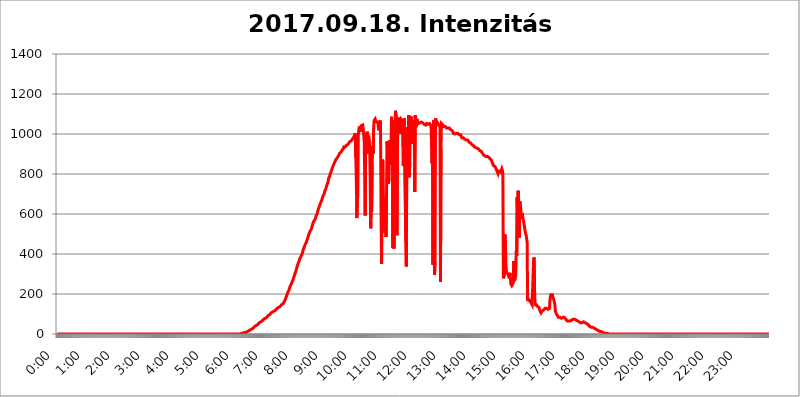
| Category | 2017.09.18. Intenzitás [W/m^2] |
|---|---|
| 0.0 | 0 |
| 0.0006944444444444445 | 0 |
| 0.001388888888888889 | 0 |
| 0.0020833333333333333 | 0 |
| 0.002777777777777778 | 0 |
| 0.003472222222222222 | 0 |
| 0.004166666666666667 | 0 |
| 0.004861111111111111 | 0 |
| 0.005555555555555556 | 0 |
| 0.0062499999999999995 | 0 |
| 0.006944444444444444 | 0 |
| 0.007638888888888889 | 0 |
| 0.008333333333333333 | 0 |
| 0.009027777777777779 | 0 |
| 0.009722222222222222 | 0 |
| 0.010416666666666666 | 0 |
| 0.011111111111111112 | 0 |
| 0.011805555555555555 | 0 |
| 0.012499999999999999 | 0 |
| 0.013194444444444444 | 0 |
| 0.013888888888888888 | 0 |
| 0.014583333333333332 | 0 |
| 0.015277777777777777 | 0 |
| 0.015972222222222224 | 0 |
| 0.016666666666666666 | 0 |
| 0.017361111111111112 | 0 |
| 0.018055555555555557 | 0 |
| 0.01875 | 0 |
| 0.019444444444444445 | 0 |
| 0.02013888888888889 | 0 |
| 0.020833333333333332 | 0 |
| 0.02152777777777778 | 0 |
| 0.022222222222222223 | 0 |
| 0.02291666666666667 | 0 |
| 0.02361111111111111 | 0 |
| 0.024305555555555556 | 0 |
| 0.024999999999999998 | 0 |
| 0.025694444444444447 | 0 |
| 0.02638888888888889 | 0 |
| 0.027083333333333334 | 0 |
| 0.027777777777777776 | 0 |
| 0.02847222222222222 | 0 |
| 0.029166666666666664 | 0 |
| 0.029861111111111113 | 0 |
| 0.030555555555555555 | 0 |
| 0.03125 | 0 |
| 0.03194444444444445 | 0 |
| 0.03263888888888889 | 0 |
| 0.03333333333333333 | 0 |
| 0.034027777777777775 | 0 |
| 0.034722222222222224 | 0 |
| 0.035416666666666666 | 0 |
| 0.036111111111111115 | 0 |
| 0.03680555555555556 | 0 |
| 0.0375 | 0 |
| 0.03819444444444444 | 0 |
| 0.03888888888888889 | 0 |
| 0.03958333333333333 | 0 |
| 0.04027777777777778 | 0 |
| 0.04097222222222222 | 0 |
| 0.041666666666666664 | 0 |
| 0.042361111111111106 | 0 |
| 0.04305555555555556 | 0 |
| 0.043750000000000004 | 0 |
| 0.044444444444444446 | 0 |
| 0.04513888888888889 | 0 |
| 0.04583333333333334 | 0 |
| 0.04652777777777778 | 0 |
| 0.04722222222222222 | 0 |
| 0.04791666666666666 | 0 |
| 0.04861111111111111 | 0 |
| 0.049305555555555554 | 0 |
| 0.049999999999999996 | 0 |
| 0.05069444444444445 | 0 |
| 0.051388888888888894 | 0 |
| 0.052083333333333336 | 0 |
| 0.05277777777777778 | 0 |
| 0.05347222222222222 | 0 |
| 0.05416666666666667 | 0 |
| 0.05486111111111111 | 0 |
| 0.05555555555555555 | 0 |
| 0.05625 | 0 |
| 0.05694444444444444 | 0 |
| 0.057638888888888885 | 0 |
| 0.05833333333333333 | 0 |
| 0.05902777777777778 | 0 |
| 0.059722222222222225 | 0 |
| 0.06041666666666667 | 0 |
| 0.061111111111111116 | 0 |
| 0.06180555555555556 | 0 |
| 0.0625 | 0 |
| 0.06319444444444444 | 0 |
| 0.06388888888888888 | 0 |
| 0.06458333333333334 | 0 |
| 0.06527777777777778 | 0 |
| 0.06597222222222222 | 0 |
| 0.06666666666666667 | 0 |
| 0.06736111111111111 | 0 |
| 0.06805555555555555 | 0 |
| 0.06874999999999999 | 0 |
| 0.06944444444444443 | 0 |
| 0.07013888888888889 | 0 |
| 0.07083333333333333 | 0 |
| 0.07152777777777779 | 0 |
| 0.07222222222222223 | 0 |
| 0.07291666666666667 | 0 |
| 0.07361111111111111 | 0 |
| 0.07430555555555556 | 0 |
| 0.075 | 0 |
| 0.07569444444444444 | 0 |
| 0.0763888888888889 | 0 |
| 0.07708333333333334 | 0 |
| 0.07777777777777778 | 0 |
| 0.07847222222222222 | 0 |
| 0.07916666666666666 | 0 |
| 0.0798611111111111 | 0 |
| 0.08055555555555556 | 0 |
| 0.08125 | 0 |
| 0.08194444444444444 | 0 |
| 0.08263888888888889 | 0 |
| 0.08333333333333333 | 0 |
| 0.08402777777777777 | 0 |
| 0.08472222222222221 | 0 |
| 0.08541666666666665 | 0 |
| 0.08611111111111112 | 0 |
| 0.08680555555555557 | 0 |
| 0.08750000000000001 | 0 |
| 0.08819444444444445 | 0 |
| 0.08888888888888889 | 0 |
| 0.08958333333333333 | 0 |
| 0.09027777777777778 | 0 |
| 0.09097222222222222 | 0 |
| 0.09166666666666667 | 0 |
| 0.09236111111111112 | 0 |
| 0.09305555555555556 | 0 |
| 0.09375 | 0 |
| 0.09444444444444444 | 0 |
| 0.09513888888888888 | 0 |
| 0.09583333333333333 | 0 |
| 0.09652777777777777 | 0 |
| 0.09722222222222222 | 0 |
| 0.09791666666666667 | 0 |
| 0.09861111111111111 | 0 |
| 0.09930555555555555 | 0 |
| 0.09999999999999999 | 0 |
| 0.10069444444444443 | 0 |
| 0.1013888888888889 | 0 |
| 0.10208333333333335 | 0 |
| 0.10277777777777779 | 0 |
| 0.10347222222222223 | 0 |
| 0.10416666666666667 | 0 |
| 0.10486111111111111 | 0 |
| 0.10555555555555556 | 0 |
| 0.10625 | 0 |
| 0.10694444444444444 | 0 |
| 0.1076388888888889 | 0 |
| 0.10833333333333334 | 0 |
| 0.10902777777777778 | 0 |
| 0.10972222222222222 | 0 |
| 0.1111111111111111 | 0 |
| 0.11180555555555556 | 0 |
| 0.11180555555555556 | 0 |
| 0.1125 | 0 |
| 0.11319444444444444 | 0 |
| 0.11388888888888889 | 0 |
| 0.11458333333333333 | 0 |
| 0.11527777777777777 | 0 |
| 0.11597222222222221 | 0 |
| 0.11666666666666665 | 0 |
| 0.1173611111111111 | 0 |
| 0.11805555555555557 | 0 |
| 0.11944444444444445 | 0 |
| 0.12013888888888889 | 0 |
| 0.12083333333333333 | 0 |
| 0.12152777777777778 | 0 |
| 0.12222222222222223 | 0 |
| 0.12291666666666667 | 0 |
| 0.12291666666666667 | 0 |
| 0.12361111111111112 | 0 |
| 0.12430555555555556 | 0 |
| 0.125 | 0 |
| 0.12569444444444444 | 0 |
| 0.12638888888888888 | 0 |
| 0.12708333333333333 | 0 |
| 0.16875 | 0 |
| 0.12847222222222224 | 0 |
| 0.12916666666666668 | 0 |
| 0.12986111111111112 | 0 |
| 0.13055555555555556 | 0 |
| 0.13125 | 0 |
| 0.13194444444444445 | 0 |
| 0.1326388888888889 | 0 |
| 0.13333333333333333 | 0 |
| 0.13402777777777777 | 0 |
| 0.13402777777777777 | 0 |
| 0.13472222222222222 | 0 |
| 0.13541666666666666 | 0 |
| 0.1361111111111111 | 0 |
| 0.13749999999999998 | 0 |
| 0.13819444444444443 | 0 |
| 0.1388888888888889 | 0 |
| 0.13958333333333334 | 0 |
| 0.14027777777777778 | 0 |
| 0.14097222222222222 | 0 |
| 0.14166666666666666 | 0 |
| 0.1423611111111111 | 0 |
| 0.14305555555555557 | 0 |
| 0.14375000000000002 | 0 |
| 0.14444444444444446 | 0 |
| 0.1451388888888889 | 0 |
| 0.1451388888888889 | 0 |
| 0.14652777777777778 | 0 |
| 0.14722222222222223 | 0 |
| 0.14791666666666667 | 0 |
| 0.1486111111111111 | 0 |
| 0.14930555555555555 | 0 |
| 0.15 | 0 |
| 0.15069444444444444 | 0 |
| 0.15138888888888888 | 0 |
| 0.15208333333333332 | 0 |
| 0.15277777777777776 | 0 |
| 0.15347222222222223 | 0 |
| 0.15416666666666667 | 0 |
| 0.15486111111111112 | 0 |
| 0.15555555555555556 | 0 |
| 0.15625 | 0 |
| 0.15694444444444444 | 0 |
| 0.15763888888888888 | 0 |
| 0.15833333333333333 | 0 |
| 0.15902777777777777 | 0 |
| 0.15972222222222224 | 0 |
| 0.16041666666666668 | 0 |
| 0.16111111111111112 | 0 |
| 0.16180555555555556 | 0 |
| 0.1625 | 0 |
| 0.16319444444444445 | 0 |
| 0.1638888888888889 | 0 |
| 0.16458333333333333 | 0 |
| 0.16527777777777777 | 0 |
| 0.16597222222222222 | 0 |
| 0.16666666666666666 | 0 |
| 0.1673611111111111 | 0 |
| 0.16805555555555554 | 0 |
| 0.16874999999999998 | 0 |
| 0.16944444444444443 | 0 |
| 0.17013888888888887 | 0 |
| 0.1708333333333333 | 0 |
| 0.17152777777777775 | 0 |
| 0.17222222222222225 | 0 |
| 0.1729166666666667 | 0 |
| 0.17361111111111113 | 0 |
| 0.17430555555555557 | 0 |
| 0.17500000000000002 | 0 |
| 0.17569444444444446 | 0 |
| 0.1763888888888889 | 0 |
| 0.17708333333333334 | 0 |
| 0.17777777777777778 | 0 |
| 0.17847222222222223 | 0 |
| 0.17916666666666667 | 0 |
| 0.1798611111111111 | 0 |
| 0.18055555555555555 | 0 |
| 0.18125 | 0 |
| 0.18194444444444444 | 0 |
| 0.1826388888888889 | 0 |
| 0.18333333333333335 | 0 |
| 0.1840277777777778 | 0 |
| 0.18472222222222223 | 0 |
| 0.18541666666666667 | 0 |
| 0.18611111111111112 | 0 |
| 0.18680555555555556 | 0 |
| 0.1875 | 0 |
| 0.18819444444444444 | 0 |
| 0.18888888888888888 | 0 |
| 0.18958333333333333 | 0 |
| 0.19027777777777777 | 0 |
| 0.1909722222222222 | 0 |
| 0.19166666666666665 | 0 |
| 0.19236111111111112 | 0 |
| 0.19305555555555554 | 0 |
| 0.19375 | 0 |
| 0.19444444444444445 | 0 |
| 0.1951388888888889 | 0 |
| 0.19583333333333333 | 0 |
| 0.19652777777777777 | 0 |
| 0.19722222222222222 | 0 |
| 0.19791666666666666 | 0 |
| 0.1986111111111111 | 0 |
| 0.19930555555555554 | 0 |
| 0.19999999999999998 | 0 |
| 0.20069444444444443 | 0 |
| 0.20138888888888887 | 0 |
| 0.2020833333333333 | 0 |
| 0.2027777777777778 | 0 |
| 0.2034722222222222 | 0 |
| 0.2041666666666667 | 0 |
| 0.20486111111111113 | 0 |
| 0.20555555555555557 | 0 |
| 0.20625000000000002 | 0 |
| 0.20694444444444446 | 0 |
| 0.2076388888888889 | 0 |
| 0.20833333333333334 | 0 |
| 0.20902777777777778 | 0 |
| 0.20972222222222223 | 0 |
| 0.21041666666666667 | 0 |
| 0.2111111111111111 | 0 |
| 0.21180555555555555 | 0 |
| 0.2125 | 0 |
| 0.21319444444444444 | 0 |
| 0.2138888888888889 | 0 |
| 0.21458333333333335 | 0 |
| 0.2152777777777778 | 0 |
| 0.21597222222222223 | 0 |
| 0.21666666666666667 | 0 |
| 0.21736111111111112 | 0 |
| 0.21805555555555556 | 0 |
| 0.21875 | 0 |
| 0.21944444444444444 | 0 |
| 0.22013888888888888 | 0 |
| 0.22083333333333333 | 0 |
| 0.22152777777777777 | 0 |
| 0.2222222222222222 | 0 |
| 0.22291666666666665 | 0 |
| 0.2236111111111111 | 0 |
| 0.22430555555555556 | 0 |
| 0.225 | 0 |
| 0.22569444444444445 | 0 |
| 0.2263888888888889 | 0 |
| 0.22708333333333333 | 0 |
| 0.22777777777777777 | 0 |
| 0.22847222222222222 | 0 |
| 0.22916666666666666 | 0 |
| 0.2298611111111111 | 0 |
| 0.23055555555555554 | 0 |
| 0.23124999999999998 | 0 |
| 0.23194444444444443 | 0 |
| 0.23263888888888887 | 0 |
| 0.2333333333333333 | 0 |
| 0.2340277777777778 | 0 |
| 0.2347222222222222 | 0 |
| 0.2354166666666667 | 0 |
| 0.23611111111111113 | 0 |
| 0.23680555555555557 | 0 |
| 0.23750000000000002 | 0 |
| 0.23819444444444446 | 0 |
| 0.2388888888888889 | 0 |
| 0.23958333333333334 | 0 |
| 0.24027777777777778 | 0 |
| 0.24097222222222223 | 0 |
| 0.24166666666666667 | 0 |
| 0.2423611111111111 | 0 |
| 0.24305555555555555 | 0 |
| 0.24375 | 0 |
| 0.24444444444444446 | 0 |
| 0.24513888888888888 | 0 |
| 0.24583333333333335 | 0 |
| 0.2465277777777778 | 0 |
| 0.24722222222222223 | 0 |
| 0.24791666666666667 | 0 |
| 0.24861111111111112 | 0 |
| 0.24930555555555556 | 0 |
| 0.25 | 0 |
| 0.25069444444444444 | 0 |
| 0.2513888888888889 | 0 |
| 0.2520833333333333 | 0 |
| 0.25277777777777777 | 0 |
| 0.2534722222222222 | 0 |
| 0.25416666666666665 | 0 |
| 0.2548611111111111 | 0 |
| 0.2555555555555556 | 0 |
| 0.25625000000000003 | 0 |
| 0.2569444444444445 | 3.525 |
| 0.2576388888888889 | 3.525 |
| 0.25833333333333336 | 3.525 |
| 0.2590277777777778 | 3.525 |
| 0.25972222222222224 | 3.525 |
| 0.2604166666666667 | 3.525 |
| 0.2611111111111111 | 3.525 |
| 0.26180555555555557 | 3.525 |
| 0.2625 | 7.887 |
| 0.26319444444444445 | 7.887 |
| 0.2638888888888889 | 7.887 |
| 0.26458333333333334 | 7.887 |
| 0.2652777777777778 | 12.257 |
| 0.2659722222222222 | 12.257 |
| 0.26666666666666666 | 12.257 |
| 0.2673611111111111 | 12.257 |
| 0.26805555555555555 | 16.636 |
| 0.26875 | 16.636 |
| 0.26944444444444443 | 16.636 |
| 0.2701388888888889 | 21.024 |
| 0.2708333333333333 | 21.024 |
| 0.27152777777777776 | 25.419 |
| 0.2722222222222222 | 25.419 |
| 0.27291666666666664 | 25.419 |
| 0.2736111111111111 | 29.823 |
| 0.2743055555555555 | 29.823 |
| 0.27499999999999997 | 29.823 |
| 0.27569444444444446 | 34.234 |
| 0.27638888888888885 | 34.234 |
| 0.27708333333333335 | 38.653 |
| 0.2777777777777778 | 38.653 |
| 0.27847222222222223 | 38.653 |
| 0.2791666666666667 | 43.079 |
| 0.2798611111111111 | 43.079 |
| 0.28055555555555556 | 47.511 |
| 0.28125 | 47.511 |
| 0.28194444444444444 | 51.951 |
| 0.2826388888888889 | 51.951 |
| 0.2833333333333333 | 56.398 |
| 0.28402777777777777 | 56.398 |
| 0.2847222222222222 | 56.398 |
| 0.28541666666666665 | 60.85 |
| 0.28611111111111115 | 60.85 |
| 0.28680555555555554 | 65.31 |
| 0.28750000000000003 | 65.31 |
| 0.2881944444444445 | 69.775 |
| 0.2888888888888889 | 69.775 |
| 0.28958333333333336 | 74.246 |
| 0.2902777777777778 | 74.246 |
| 0.29097222222222224 | 78.722 |
| 0.2916666666666667 | 78.722 |
| 0.2923611111111111 | 78.722 |
| 0.29305555555555557 | 83.205 |
| 0.29375 | 83.205 |
| 0.29444444444444445 | 87.692 |
| 0.2951388888888889 | 87.692 |
| 0.29583333333333334 | 92.184 |
| 0.2965277777777778 | 92.184 |
| 0.2972222222222222 | 96.682 |
| 0.29791666666666666 | 96.682 |
| 0.2986111111111111 | 101.184 |
| 0.29930555555555555 | 101.184 |
| 0.3 | 105.69 |
| 0.30069444444444443 | 105.69 |
| 0.3013888888888889 | 105.69 |
| 0.3020833333333333 | 110.201 |
| 0.30277777777777776 | 110.201 |
| 0.3034722222222222 | 110.201 |
| 0.30416666666666664 | 114.716 |
| 0.3048611111111111 | 114.716 |
| 0.3055555555555555 | 119.235 |
| 0.30624999999999997 | 119.235 |
| 0.3069444444444444 | 119.235 |
| 0.3076388888888889 | 123.758 |
| 0.30833333333333335 | 128.284 |
| 0.3090277777777778 | 128.284 |
| 0.30972222222222223 | 128.284 |
| 0.3104166666666667 | 132.814 |
| 0.3111111111111111 | 132.814 |
| 0.31180555555555556 | 137.347 |
| 0.3125 | 137.347 |
| 0.31319444444444444 | 141.884 |
| 0.3138888888888889 | 141.884 |
| 0.3145833333333333 | 146.423 |
| 0.31527777777777777 | 146.423 |
| 0.3159722222222222 | 146.423 |
| 0.31666666666666665 | 150.964 |
| 0.31736111111111115 | 155.509 |
| 0.31805555555555554 | 160.056 |
| 0.31875000000000003 | 164.605 |
| 0.3194444444444445 | 169.156 |
| 0.3201388888888889 | 173.709 |
| 0.32083333333333336 | 182.82 |
| 0.3215277777777778 | 187.378 |
| 0.32222222222222224 | 196.497 |
| 0.3229166666666667 | 201.058 |
| 0.3236111111111111 | 210.182 |
| 0.32430555555555557 | 214.746 |
| 0.325 | 219.309 |
| 0.32569444444444445 | 228.436 |
| 0.3263888888888889 | 233 |
| 0.32708333333333334 | 242.127 |
| 0.3277777777777778 | 246.689 |
| 0.3284722222222222 | 251.251 |
| 0.32916666666666666 | 260.373 |
| 0.3298611111111111 | 264.932 |
| 0.33055555555555555 | 269.49 |
| 0.33125 | 278.603 |
| 0.33194444444444443 | 283.156 |
| 0.3326388888888889 | 292.259 |
| 0.3333333333333333 | 301.354 |
| 0.3340277777777778 | 305.898 |
| 0.3347222222222222 | 314.98 |
| 0.3354166666666667 | 324.052 |
| 0.3361111111111111 | 333.113 |
| 0.3368055555555556 | 342.162 |
| 0.33749999999999997 | 346.682 |
| 0.33819444444444446 | 355.712 |
| 0.33888888888888885 | 360.221 |
| 0.33958333333333335 | 369.23 |
| 0.34027777777777773 | 378.224 |
| 0.34097222222222223 | 378.224 |
| 0.3416666666666666 | 387.202 |
| 0.3423611111111111 | 391.685 |
| 0.3430555555555555 | 396.164 |
| 0.34375 | 405.108 |
| 0.3444444444444445 | 414.035 |
| 0.3451388888888889 | 422.943 |
| 0.3458333333333334 | 427.39 |
| 0.34652777777777777 | 436.27 |
| 0.34722222222222227 | 440.702 |
| 0.34791666666666665 | 449.551 |
| 0.34861111111111115 | 453.968 |
| 0.34930555555555554 | 458.38 |
| 0.35000000000000003 | 467.187 |
| 0.3506944444444444 | 471.582 |
| 0.3513888888888889 | 480.356 |
| 0.3520833333333333 | 489.108 |
| 0.3527777777777778 | 497.836 |
| 0.3534722222222222 | 502.192 |
| 0.3541666666666667 | 510.885 |
| 0.3548611111111111 | 515.223 |
| 0.35555555555555557 | 515.223 |
| 0.35625 | 523.88 |
| 0.35694444444444445 | 532.513 |
| 0.3576388888888889 | 541.121 |
| 0.35833333333333334 | 549.704 |
| 0.3590277777777778 | 558.261 |
| 0.3597222222222222 | 562.53 |
| 0.36041666666666666 | 566.793 |
| 0.3611111111111111 | 571.049 |
| 0.36180555555555555 | 575.299 |
| 0.3625 | 583.779 |
| 0.36319444444444443 | 592.233 |
| 0.3638888888888889 | 596.45 |
| 0.3645833333333333 | 600.661 |
| 0.3652777777777778 | 613.252 |
| 0.3659722222222222 | 621.613 |
| 0.3666666666666667 | 629.948 |
| 0.3673611111111111 | 634.105 |
| 0.3680555555555556 | 642.4 |
| 0.36874999999999997 | 650.667 |
| 0.36944444444444446 | 654.791 |
| 0.37013888888888885 | 663.019 |
| 0.37083333333333335 | 667.123 |
| 0.37152777777777773 | 675.311 |
| 0.37222222222222223 | 683.473 |
| 0.3729166666666666 | 691.608 |
| 0.3736111111111111 | 695.666 |
| 0.3743055555555555 | 699.717 |
| 0.375 | 711.832 |
| 0.3756944444444445 | 715.858 |
| 0.3763888888888889 | 723.889 |
| 0.3770833333333334 | 731.896 |
| 0.37777777777777777 | 739.877 |
| 0.37847222222222227 | 747.834 |
| 0.37916666666666665 | 751.803 |
| 0.37986111111111115 | 759.723 |
| 0.38055555555555554 | 779.42 |
| 0.38125000000000003 | 779.42 |
| 0.3819444444444444 | 787.258 |
| 0.3826388888888889 | 798.974 |
| 0.3833333333333333 | 802.868 |
| 0.3840277777777778 | 810.641 |
| 0.3847222222222222 | 818.392 |
| 0.3854166666666667 | 826.123 |
| 0.3861111111111111 | 833.834 |
| 0.38680555555555557 | 837.682 |
| 0.3875 | 845.365 |
| 0.38819444444444445 | 849.199 |
| 0.3888888888888889 | 856.855 |
| 0.38958333333333334 | 860.676 |
| 0.3902777777777778 | 868.305 |
| 0.3909722222222222 | 868.305 |
| 0.39166666666666666 | 875.918 |
| 0.3923611111111111 | 879.719 |
| 0.39305555555555555 | 883.516 |
| 0.39375 | 887.309 |
| 0.39444444444444443 | 891.099 |
| 0.3951388888888889 | 894.885 |
| 0.3958333333333333 | 902.447 |
| 0.3965277777777778 | 902.447 |
| 0.3972222222222222 | 906.223 |
| 0.3979166666666667 | 909.996 |
| 0.3986111111111111 | 913.766 |
| 0.3993055555555556 | 917.534 |
| 0.39999999999999997 | 921.298 |
| 0.40069444444444446 | 917.534 |
| 0.40138888888888885 | 928.819 |
| 0.40208333333333335 | 936.33 |
| 0.40277777777777773 | 936.33 |
| 0.40347222222222223 | 940.082 |
| 0.4041666666666666 | 936.33 |
| 0.4048611111111111 | 940.082 |
| 0.4055555555555555 | 943.832 |
| 0.40625 | 943.832 |
| 0.4069444444444445 | 947.58 |
| 0.4076388888888889 | 947.58 |
| 0.4083333333333334 | 951.327 |
| 0.40902777777777777 | 955.071 |
| 0.40972222222222227 | 955.071 |
| 0.41041666666666665 | 962.555 |
| 0.41111111111111115 | 962.555 |
| 0.41180555555555554 | 962.555 |
| 0.41250000000000003 | 966.295 |
| 0.4131944444444444 | 970.034 |
| 0.4138888888888889 | 973.772 |
| 0.4145833333333333 | 977.508 |
| 0.4152777777777778 | 977.508 |
| 0.4159722222222222 | 984.98 |
| 0.4166666666666667 | 988.714 |
| 0.4173611111111111 | 996.182 |
| 0.41805555555555557 | 1003.65 |
| 0.41875 | 883.516 |
| 0.41944444444444445 | 771.559 |
| 0.4201388888888889 | 579.542 |
| 0.42083333333333334 | 658.909 |
| 0.4215277777777778 | 691.608 |
| 0.4222222222222222 | 992.448 |
| 0.42291666666666666 | 1018.587 |
| 0.4236111111111111 | 1037.277 |
| 0.42430555555555555 | 1041.019 |
| 0.425 | 1037.277 |
| 0.42569444444444443 | 1011.118 |
| 0.4263888888888889 | 1041.019 |
| 0.4270833333333333 | 1037.277 |
| 0.4277777777777778 | 1044.762 |
| 0.4284722222222222 | 1044.762 |
| 0.4291666666666667 | 1022.323 |
| 0.4298611111111111 | 996.182 |
| 0.4305555555555556 | 962.555 |
| 0.43124999999999997 | 962.555 |
| 0.43194444444444446 | 592.233 |
| 0.43263888888888885 | 999.916 |
| 0.43333333333333335 | 984.98 |
| 0.43402777777777773 | 966.295 |
| 0.43472222222222223 | 1011.118 |
| 0.4354166666666666 | 902.447 |
| 0.4361111111111111 | 977.508 |
| 0.4368055555555555 | 992.448 |
| 0.4375 | 996.182 |
| 0.4381944444444445 | 928.819 |
| 0.4388888888888889 | 779.42 |
| 0.4395833333333334 | 528.2 |
| 0.44027777777777777 | 650.667 |
| 0.44097222222222227 | 613.252 |
| 0.44166666666666665 | 849.199 |
| 0.44236111111111115 | 940.082 |
| 0.44305555555555554 | 902.447 |
| 0.44375000000000003 | 1029.798 |
| 0.4444444444444444 | 1067.267 |
| 0.4451388888888889 | 1067.267 |
| 0.4458333333333333 | 1074.789 |
| 0.4465277777777778 | 1067.267 |
| 0.4472222222222222 | 1063.51 |
| 0.4479166666666667 | 1063.51 |
| 0.4486111111111111 | 1059.756 |
| 0.44930555555555557 | 1059.756 |
| 0.45 | 1052.255 |
| 0.45069444444444445 | 1018.587 |
| 0.4513888888888889 | 1059.756 |
| 0.45208333333333334 | 1048.508 |
| 0.4527777777777778 | 1067.267 |
| 0.4534722222222222 | 1007.383 |
| 0.45416666666666666 | 609.062 |
| 0.4548611111111111 | 351.198 |
| 0.45555555555555555 | 841.526 |
| 0.45625 | 872.114 |
| 0.45694444444444443 | 860.676 |
| 0.4576388888888889 | 558.261 |
| 0.4583333333333333 | 506.542 |
| 0.4590277777777778 | 683.473 |
| 0.4597222222222222 | 687.544 |
| 0.4604166666666667 | 596.45 |
| 0.4611111111111111 | 484.735 |
| 0.4618055555555556 | 687.544 |
| 0.46249999999999997 | 962.555 |
| 0.46319444444444446 | 921.298 |
| 0.46388888888888885 | 787.258 |
| 0.46458333333333335 | 751.803 |
| 0.46527777777777773 | 779.42 |
| 0.46597222222222223 | 970.034 |
| 0.4666666666666666 | 966.295 |
| 0.4673611111111111 | 845.365 |
| 0.4680555555555555 | 917.534 |
| 0.46875 | 1086.097 |
| 0.4694444444444445 | 913.766 |
| 0.4701388888888889 | 1067.267 |
| 0.4708333333333334 | 431.833 |
| 0.47152777777777777 | 743.859 |
| 0.47222222222222227 | 427.39 |
| 0.47291666666666665 | 1003.65 |
| 0.47361111111111115 | 1041.019 |
| 0.47430555555555554 | 1116.426 |
| 0.47500000000000003 | 1101.226 |
| 0.4756944444444444 | 1089.873 |
| 0.4763888888888889 | 493.475 |
| 0.4770833333333333 | 891.099 |
| 0.4777777777777778 | 1071.027 |
| 0.4784722222222222 | 1082.324 |
| 0.4791666666666667 | 1086.097 |
| 0.4798611111111111 | 1086.097 |
| 0.48055555555555557 | 999.916 |
| 0.48125 | 1067.267 |
| 0.48194444444444445 | 1074.789 |
| 0.4826388888888889 | 1078.555 |
| 0.48333333333333334 | 1074.789 |
| 0.4840277777777778 | 1063.51 |
| 0.4847222222222222 | 940.082 |
| 0.48541666666666666 | 841.526 |
| 0.4861111111111111 | 1018.587 |
| 0.48680555555555555 | 1078.555 |
| 0.4875 | 1078.555 |
| 0.48819444444444443 | 1078.555 |
| 0.4888888888888889 | 458.38 |
| 0.4895833333333333 | 337.639 |
| 0.4902777777777778 | 943.832 |
| 0.4909722222222222 | 1033.537 |
| 0.4916666666666667 | 1037.277 |
| 0.4923611111111111 | 1014.852 |
| 0.4930555555555556 | 1093.653 |
| 0.49374999999999997 | 783.342 |
| 0.49444444444444446 | 856.855 |
| 0.49513888888888885 | 1089.873 |
| 0.49583333333333335 | 1056.004 |
| 0.49652777777777773 | 1086.097 |
| 0.49722222222222223 | 1086.097 |
| 0.4979166666666666 | 1086.097 |
| 0.4986111111111111 | 951.327 |
| 0.4993055555555555 | 1018.587 |
| 0.5 | 1059.756 |
| 0.5006944444444444 | 1067.267 |
| 0.5013888888888889 | 711.832 |
| 0.5020833333333333 | 1093.653 |
| 0.5027777777777778 | 1052.255 |
| 0.5034722222222222 | 1033.537 |
| 0.5041666666666667 | 1074.789 |
| 0.5048611111111111 | 1074.789 |
| 0.5055555555555555 | 1074.789 |
| 0.50625 | 1052.255 |
| 0.5069444444444444 | 1048.508 |
| 0.5076388888888889 | 1052.255 |
| 0.5083333333333333 | 1056.004 |
| 0.5090277777777777 | 1059.756 |
| 0.5097222222222222 | 1059.756 |
| 0.5104166666666666 | 1059.756 |
| 0.5111111111111112 | 1059.756 |
| 0.5118055555555555 | 1056.004 |
| 0.5125000000000001 | 1056.004 |
| 0.5131944444444444 | 1052.255 |
| 0.513888888888889 | 1052.255 |
| 0.5145833333333333 | 1048.508 |
| 0.5152777777777778 | 1044.762 |
| 0.5159722222222222 | 1044.762 |
| 0.5166666666666667 | 1044.762 |
| 0.517361111111111 | 1048.508 |
| 0.5180555555555556 | 1052.255 |
| 0.5187499999999999 | 1052.255 |
| 0.5194444444444445 | 1052.255 |
| 0.5201388888888888 | 1048.508 |
| 0.5208333333333334 | 1052.255 |
| 0.5215277777777778 | 1052.255 |
| 0.5222222222222223 | 1052.255 |
| 0.5229166666666667 | 1056.004 |
| 0.5236111111111111 | 1052.255 |
| 0.5243055555555556 | 1041.019 |
| 0.525 | 1044.762 |
| 0.5256944444444445 | 853.029 |
| 0.5263888888888889 | 1033.537 |
| 0.5270833333333333 | 346.682 |
| 0.5277777777777778 | 1067.267 |
| 0.5284722222222222 | 1071.027 |
| 0.5291666666666667 | 296.808 |
| 0.5298611111111111 | 360.221 |
| 0.5305555555555556 | 1078.555 |
| 0.53125 | 1067.267 |
| 0.5319444444444444 | 1063.51 |
| 0.5326388888888889 | 1063.51 |
| 0.5333333333333333 | 1056.004 |
| 0.5340277777777778 | 1052.255 |
| 0.5347222222222222 | 1044.762 |
| 0.5354166666666667 | 1044.762 |
| 0.5361111111111111 | 1048.508 |
| 0.5368055555555555 | 1044.762 |
| 0.5375 | 260.373 |
| 0.5381944444444444 | 925.06 |
| 0.5388888888888889 | 1052.255 |
| 0.5395833333333333 | 1056.004 |
| 0.5402777777777777 | 1052.255 |
| 0.5409722222222222 | 1044.762 |
| 0.5416666666666666 | 1041.019 |
| 0.5423611111111112 | 1037.277 |
| 0.5430555555555555 | 1037.277 |
| 0.5437500000000001 | 1037.277 |
| 0.5444444444444444 | 1037.277 |
| 0.545138888888889 | 1033.537 |
| 0.5458333333333333 | 1029.798 |
| 0.5465277777777778 | 1029.798 |
| 0.5472222222222222 | 1029.798 |
| 0.5479166666666667 | 1029.798 |
| 0.548611111111111 | 1029.798 |
| 0.5493055555555556 | 1029.798 |
| 0.5499999999999999 | 1029.798 |
| 0.5506944444444445 | 1026.06 |
| 0.5513888888888888 | 1022.323 |
| 0.5520833333333334 | 1022.323 |
| 0.5527777777777778 | 1022.323 |
| 0.5534722222222223 | 1018.587 |
| 0.5541666666666667 | 1014.852 |
| 0.5548611111111111 | 1011.118 |
| 0.5555555555555556 | 1003.65 |
| 0.55625 | 999.916 |
| 0.5569444444444445 | 999.916 |
| 0.5576388888888889 | 999.916 |
| 0.5583333333333333 | 1003.65 |
| 0.5590277777777778 | 1003.65 |
| 0.5597222222222222 | 1003.65 |
| 0.5604166666666667 | 1003.65 |
| 0.5611111111111111 | 1003.65 |
| 0.5618055555555556 | 1003.65 |
| 0.5625 | 1003.65 |
| 0.5631944444444444 | 999.916 |
| 0.5638888888888889 | 996.182 |
| 0.5645833333333333 | 999.916 |
| 0.5652777777777778 | 996.182 |
| 0.5659722222222222 | 996.182 |
| 0.5666666666666667 | 988.714 |
| 0.5673611111111111 | 981.244 |
| 0.5680555555555555 | 981.244 |
| 0.56875 | 981.244 |
| 0.5694444444444444 | 981.244 |
| 0.5701388888888889 | 977.508 |
| 0.5708333333333333 | 977.508 |
| 0.5715277777777777 | 973.772 |
| 0.5722222222222222 | 973.772 |
| 0.5729166666666666 | 970.034 |
| 0.5736111111111112 | 970.034 |
| 0.5743055555555555 | 970.034 |
| 0.5750000000000001 | 970.034 |
| 0.5756944444444444 | 970.034 |
| 0.576388888888889 | 966.295 |
| 0.5770833333333333 | 966.295 |
| 0.5777777777777778 | 958.814 |
| 0.5784722222222222 | 958.814 |
| 0.5791666666666667 | 958.814 |
| 0.579861111111111 | 955.071 |
| 0.5805555555555556 | 951.327 |
| 0.5812499999999999 | 947.58 |
| 0.5819444444444445 | 943.832 |
| 0.5826388888888888 | 947.58 |
| 0.5833333333333334 | 943.832 |
| 0.5840277777777778 | 940.082 |
| 0.5847222222222223 | 936.33 |
| 0.5854166666666667 | 932.576 |
| 0.5861111111111111 | 932.576 |
| 0.5868055555555556 | 932.576 |
| 0.5875 | 928.819 |
| 0.5881944444444445 | 928.819 |
| 0.5888888888888889 | 928.819 |
| 0.5895833333333333 | 928.819 |
| 0.5902777777777778 | 925.06 |
| 0.5909722222222222 | 925.06 |
| 0.5916666666666667 | 921.298 |
| 0.5923611111111111 | 917.534 |
| 0.5930555555555556 | 917.534 |
| 0.59375 | 913.766 |
| 0.5944444444444444 | 913.766 |
| 0.5951388888888889 | 909.996 |
| 0.5958333333333333 | 906.223 |
| 0.5965277777777778 | 902.447 |
| 0.5972222222222222 | 898.668 |
| 0.5979166666666667 | 894.885 |
| 0.5986111111111111 | 894.885 |
| 0.5993055555555555 | 891.099 |
| 0.6 | 891.099 |
| 0.6006944444444444 | 887.309 |
| 0.6013888888888889 | 887.309 |
| 0.6020833333333333 | 887.309 |
| 0.6027777777777777 | 887.309 |
| 0.6034722222222222 | 887.309 |
| 0.6041666666666666 | 887.309 |
| 0.6048611111111112 | 883.516 |
| 0.6055555555555555 | 883.516 |
| 0.6062500000000001 | 879.719 |
| 0.6069444444444444 | 875.918 |
| 0.607638888888889 | 875.918 |
| 0.6083333333333333 | 872.114 |
| 0.6090277777777778 | 868.305 |
| 0.6097222222222222 | 860.676 |
| 0.6104166666666667 | 860.676 |
| 0.611111111111111 | 849.199 |
| 0.6118055555555556 | 841.526 |
| 0.6124999999999999 | 841.526 |
| 0.6131944444444445 | 841.526 |
| 0.6138888888888888 | 837.682 |
| 0.6145833333333334 | 837.682 |
| 0.6152777777777778 | 833.834 |
| 0.6159722222222223 | 822.26 |
| 0.6166666666666667 | 822.26 |
| 0.6173611111111111 | 818.392 |
| 0.6180555555555556 | 802.868 |
| 0.61875 | 814.519 |
| 0.6194444444444445 | 814.519 |
| 0.6201388888888889 | 810.641 |
| 0.6208333333333333 | 814.519 |
| 0.6215277777777778 | 802.868 |
| 0.6222222222222222 | 810.641 |
| 0.6229166666666667 | 818.392 |
| 0.6236111111111111 | 826.123 |
| 0.6243055555555556 | 818.392 |
| 0.625 | 798.974 |
| 0.6256944444444444 | 278.603 |
| 0.6263888888888889 | 278.603 |
| 0.6270833333333333 | 296.808 |
| 0.6277777777777778 | 497.836 |
| 0.6284722222222222 | 475.972 |
| 0.6291666666666667 | 355.712 |
| 0.6298611111111111 | 314.98 |
| 0.6305555555555555 | 305.898 |
| 0.63125 | 310.44 |
| 0.6319444444444444 | 305.898 |
| 0.6326388888888889 | 296.808 |
| 0.6333333333333333 | 287.709 |
| 0.6340277777777777 | 278.603 |
| 0.6347222222222222 | 305.898 |
| 0.6354166666666666 | 287.709 |
| 0.6361111111111112 | 251.251 |
| 0.6368055555555555 | 246.689 |
| 0.6375000000000001 | 242.127 |
| 0.6381944444444444 | 242.127 |
| 0.638888888888889 | 242.127 |
| 0.6395833333333333 | 255.813 |
| 0.6402777777777778 | 364.728 |
| 0.6409722222222222 | 264.932 |
| 0.6416666666666667 | 269.49 |
| 0.642361111111111 | 278.603 |
| 0.6430555555555556 | 296.808 |
| 0.6437499999999999 | 414.035 |
| 0.6444444444444445 | 391.685 |
| 0.6451388888888888 | 683.473 |
| 0.6458333333333334 | 536.82 |
| 0.6465277777777778 | 715.858 |
| 0.6472222222222223 | 566.793 |
| 0.6479166666666667 | 480.356 |
| 0.6486111111111111 | 663.019 |
| 0.6493055555555556 | 654.791 |
| 0.65 | 629.948 |
| 0.6506944444444445 | 625.784 |
| 0.6513888888888889 | 575.299 |
| 0.6520833333333333 | 604.864 |
| 0.6527777777777778 | 588.009 |
| 0.6534722222222222 | 571.049 |
| 0.6541666666666667 | 562.53 |
| 0.6548611111111111 | 545.416 |
| 0.6555555555555556 | 528.2 |
| 0.65625 | 515.223 |
| 0.6569444444444444 | 502.192 |
| 0.6576388888888889 | 493.475 |
| 0.6583333333333333 | 489.108 |
| 0.6590277777777778 | 458.38 |
| 0.6597222222222222 | 164.605 |
| 0.6604166666666667 | 169.156 |
| 0.6611111111111111 | 173.709 |
| 0.6618055555555555 | 178.264 |
| 0.6625 | 173.709 |
| 0.6631944444444444 | 164.605 |
| 0.6638888888888889 | 160.056 |
| 0.6645833333333333 | 155.509 |
| 0.6652777777777777 | 150.964 |
| 0.6659722222222222 | 146.423 |
| 0.6666666666666666 | 150.964 |
| 0.6673611111111111 | 292.259 |
| 0.6680555555555556 | 360.221 |
| 0.6687500000000001 | 382.715 |
| 0.6694444444444444 | 223.873 |
| 0.6701388888888888 | 146.423 |
| 0.6708333333333334 | 141.884 |
| 0.6715277777777778 | 146.423 |
| 0.6722222222222222 | 146.423 |
| 0.6729166666666666 | 141.884 |
| 0.6736111111111112 | 137.347 |
| 0.6743055555555556 | 137.347 |
| 0.6749999999999999 | 137.347 |
| 0.6756944444444444 | 132.814 |
| 0.6763888888888889 | 123.758 |
| 0.6770833333333334 | 114.716 |
| 0.6777777777777777 | 110.201 |
| 0.6784722222222223 | 105.69 |
| 0.6791666666666667 | 110.201 |
| 0.6798611111111111 | 114.716 |
| 0.6805555555555555 | 119.235 |
| 0.68125 | 119.235 |
| 0.6819444444444445 | 119.235 |
| 0.6826388888888889 | 123.758 |
| 0.6833333333333332 | 123.758 |
| 0.6840277777777778 | 128.284 |
| 0.6847222222222222 | 128.284 |
| 0.6854166666666667 | 128.284 |
| 0.686111111111111 | 128.284 |
| 0.6868055555555556 | 128.284 |
| 0.6875 | 123.758 |
| 0.6881944444444444 | 123.758 |
| 0.688888888888889 | 123.758 |
| 0.6895833333333333 | 123.758 |
| 0.6902777777777778 | 128.284 |
| 0.6909722222222222 | 164.605 |
| 0.6916666666666668 | 187.378 |
| 0.6923611111111111 | 196.497 |
| 0.6930555555555555 | 191.937 |
| 0.69375 | 201.058 |
| 0.6944444444444445 | 196.497 |
| 0.6951388888888889 | 187.378 |
| 0.6958333333333333 | 178.264 |
| 0.6965277777777777 | 173.709 |
| 0.6972222222222223 | 160.056 |
| 0.6979166666666666 | 146.423 |
| 0.6986111111111111 | 114.716 |
| 0.6993055555555556 | 110.201 |
| 0.7000000000000001 | 101.184 |
| 0.7006944444444444 | 96.682 |
| 0.7013888888888888 | 92.184 |
| 0.7020833333333334 | 87.692 |
| 0.7027777777777778 | 83.205 |
| 0.7034722222222222 | 83.205 |
| 0.7041666666666666 | 83.205 |
| 0.7048611111111112 | 83.205 |
| 0.7055555555555556 | 78.722 |
| 0.7062499999999999 | 78.722 |
| 0.7069444444444444 | 78.722 |
| 0.7076388888888889 | 83.205 |
| 0.7083333333333334 | 83.205 |
| 0.7090277777777777 | 83.205 |
| 0.7097222222222223 | 83.205 |
| 0.7104166666666667 | 83.205 |
| 0.7111111111111111 | 83.205 |
| 0.7118055555555555 | 83.205 |
| 0.7125 | 83.205 |
| 0.7131944444444445 | 74.246 |
| 0.7138888888888889 | 74.246 |
| 0.7145833333333332 | 69.775 |
| 0.7152777777777778 | 65.31 |
| 0.7159722222222222 | 65.31 |
| 0.7166666666666667 | 65.31 |
| 0.717361111111111 | 65.31 |
| 0.7180555555555556 | 65.31 |
| 0.71875 | 65.31 |
| 0.7194444444444444 | 65.31 |
| 0.720138888888889 | 65.31 |
| 0.7208333333333333 | 65.31 |
| 0.7215277777777778 | 69.775 |
| 0.7222222222222222 | 69.775 |
| 0.7229166666666668 | 74.246 |
| 0.7236111111111111 | 74.246 |
| 0.7243055555555555 | 74.246 |
| 0.725 | 74.246 |
| 0.7256944444444445 | 74.246 |
| 0.7263888888888889 | 74.246 |
| 0.7270833333333333 | 74.246 |
| 0.7277777777777777 | 69.775 |
| 0.7284722222222223 | 65.31 |
| 0.7291666666666666 | 65.31 |
| 0.7298611111111111 | 65.31 |
| 0.7305555555555556 | 60.85 |
| 0.7312500000000001 | 60.85 |
| 0.7319444444444444 | 60.85 |
| 0.7326388888888888 | 60.85 |
| 0.7333333333333334 | 56.398 |
| 0.7340277777777778 | 56.398 |
| 0.7347222222222222 | 56.398 |
| 0.7354166666666666 | 56.398 |
| 0.7361111111111112 | 56.398 |
| 0.7368055555555556 | 56.398 |
| 0.7374999999999999 | 60.85 |
| 0.7381944444444444 | 60.85 |
| 0.7388888888888889 | 60.85 |
| 0.7395833333333334 | 60.85 |
| 0.7402777777777777 | 56.398 |
| 0.7409722222222223 | 56.398 |
| 0.7416666666666667 | 51.951 |
| 0.7423611111111111 | 51.951 |
| 0.7430555555555555 | 47.511 |
| 0.74375 | 47.511 |
| 0.7444444444444445 | 47.511 |
| 0.7451388888888889 | 43.079 |
| 0.7458333333333332 | 43.079 |
| 0.7465277777777778 | 38.653 |
| 0.7472222222222222 | 38.653 |
| 0.7479166666666667 | 38.653 |
| 0.748611111111111 | 34.234 |
| 0.7493055555555556 | 34.234 |
| 0.75 | 34.234 |
| 0.7506944444444444 | 34.234 |
| 0.751388888888889 | 29.823 |
| 0.7520833333333333 | 29.823 |
| 0.7527777777777778 | 29.823 |
| 0.7534722222222222 | 29.823 |
| 0.7541666666666668 | 29.823 |
| 0.7548611111111111 | 25.419 |
| 0.7555555555555555 | 25.419 |
| 0.75625 | 21.024 |
| 0.7569444444444445 | 21.024 |
| 0.7576388888888889 | 21.024 |
| 0.7583333333333333 | 16.636 |
| 0.7590277777777777 | 16.636 |
| 0.7597222222222223 | 16.636 |
| 0.7604166666666666 | 12.257 |
| 0.7611111111111111 | 12.257 |
| 0.7618055555555556 | 12.257 |
| 0.7625000000000001 | 12.257 |
| 0.7631944444444444 | 12.257 |
| 0.7638888888888888 | 12.257 |
| 0.7645833333333334 | 7.887 |
| 0.7652777777777778 | 7.887 |
| 0.7659722222222222 | 7.887 |
| 0.7666666666666666 | 3.525 |
| 0.7673611111111112 | 3.525 |
| 0.7680555555555556 | 3.525 |
| 0.7687499999999999 | 3.525 |
| 0.7694444444444444 | 3.525 |
| 0.7701388888888889 | 3.525 |
| 0.7708333333333334 | 3.525 |
| 0.7715277777777777 | 3.525 |
| 0.7722222222222223 | 0 |
| 0.7729166666666667 | 0 |
| 0.7736111111111111 | 0 |
| 0.7743055555555555 | 0 |
| 0.775 | 0 |
| 0.7756944444444445 | 0 |
| 0.7763888888888889 | 0 |
| 0.7770833333333332 | 0 |
| 0.7777777777777778 | 0 |
| 0.7784722222222222 | 0 |
| 0.7791666666666667 | 0 |
| 0.779861111111111 | 0 |
| 0.7805555555555556 | 0 |
| 0.78125 | 0 |
| 0.7819444444444444 | 0 |
| 0.782638888888889 | 0 |
| 0.7833333333333333 | 0 |
| 0.7840277777777778 | 0 |
| 0.7847222222222222 | 0 |
| 0.7854166666666668 | 0 |
| 0.7861111111111111 | 0 |
| 0.7868055555555555 | 0 |
| 0.7875 | 0 |
| 0.7881944444444445 | 0 |
| 0.7888888888888889 | 0 |
| 0.7895833333333333 | 0 |
| 0.7902777777777777 | 0 |
| 0.7909722222222223 | 0 |
| 0.7916666666666666 | 0 |
| 0.7923611111111111 | 0 |
| 0.7930555555555556 | 0 |
| 0.7937500000000001 | 0 |
| 0.7944444444444444 | 0 |
| 0.7951388888888888 | 0 |
| 0.7958333333333334 | 0 |
| 0.7965277777777778 | 0 |
| 0.7972222222222222 | 0 |
| 0.7979166666666666 | 0 |
| 0.7986111111111112 | 0 |
| 0.7993055555555556 | 0 |
| 0.7999999999999999 | 0 |
| 0.8006944444444444 | 0 |
| 0.8013888888888889 | 0 |
| 0.8020833333333334 | 0 |
| 0.8027777777777777 | 0 |
| 0.8034722222222223 | 0 |
| 0.8041666666666667 | 0 |
| 0.8048611111111111 | 0 |
| 0.8055555555555555 | 0 |
| 0.80625 | 0 |
| 0.8069444444444445 | 0 |
| 0.8076388888888889 | 0 |
| 0.8083333333333332 | 0 |
| 0.8090277777777778 | 0 |
| 0.8097222222222222 | 0 |
| 0.8104166666666667 | 0 |
| 0.811111111111111 | 0 |
| 0.8118055555555556 | 0 |
| 0.8125 | 0 |
| 0.8131944444444444 | 0 |
| 0.813888888888889 | 0 |
| 0.8145833333333333 | 0 |
| 0.8152777777777778 | 0 |
| 0.8159722222222222 | 0 |
| 0.8166666666666668 | 0 |
| 0.8173611111111111 | 0 |
| 0.8180555555555555 | 0 |
| 0.81875 | 0 |
| 0.8194444444444445 | 0 |
| 0.8201388888888889 | 0 |
| 0.8208333333333333 | 0 |
| 0.8215277777777777 | 0 |
| 0.8222222222222223 | 0 |
| 0.8229166666666666 | 0 |
| 0.8236111111111111 | 0 |
| 0.8243055555555556 | 0 |
| 0.8250000000000001 | 0 |
| 0.8256944444444444 | 0 |
| 0.8263888888888888 | 0 |
| 0.8270833333333334 | 0 |
| 0.8277777777777778 | 0 |
| 0.8284722222222222 | 0 |
| 0.8291666666666666 | 0 |
| 0.8298611111111112 | 0 |
| 0.8305555555555556 | 0 |
| 0.8312499999999999 | 0 |
| 0.8319444444444444 | 0 |
| 0.8326388888888889 | 0 |
| 0.8333333333333334 | 0 |
| 0.8340277777777777 | 0 |
| 0.8347222222222223 | 0 |
| 0.8354166666666667 | 0 |
| 0.8361111111111111 | 0 |
| 0.8368055555555555 | 0 |
| 0.8375 | 0 |
| 0.8381944444444445 | 0 |
| 0.8388888888888889 | 0 |
| 0.8395833333333332 | 0 |
| 0.8402777777777778 | 0 |
| 0.8409722222222222 | 0 |
| 0.8416666666666667 | 0 |
| 0.842361111111111 | 0 |
| 0.8430555555555556 | 0 |
| 0.84375 | 0 |
| 0.8444444444444444 | 0 |
| 0.845138888888889 | 0 |
| 0.8458333333333333 | 0 |
| 0.8465277777777778 | 0 |
| 0.8472222222222222 | 0 |
| 0.8479166666666668 | 0 |
| 0.8486111111111111 | 0 |
| 0.8493055555555555 | 0 |
| 0.85 | 0 |
| 0.8506944444444445 | 0 |
| 0.8513888888888889 | 0 |
| 0.8520833333333333 | 0 |
| 0.8527777777777777 | 0 |
| 0.8534722222222223 | 0 |
| 0.8541666666666666 | 0 |
| 0.8548611111111111 | 0 |
| 0.8555555555555556 | 0 |
| 0.8562500000000001 | 0 |
| 0.8569444444444444 | 0 |
| 0.8576388888888888 | 0 |
| 0.8583333333333334 | 0 |
| 0.8590277777777778 | 0 |
| 0.8597222222222222 | 0 |
| 0.8604166666666666 | 0 |
| 0.8611111111111112 | 0 |
| 0.8618055555555556 | 0 |
| 0.8624999999999999 | 0 |
| 0.8631944444444444 | 0 |
| 0.8638888888888889 | 0 |
| 0.8645833333333334 | 0 |
| 0.8652777777777777 | 0 |
| 0.8659722222222223 | 0 |
| 0.8666666666666667 | 0 |
| 0.8673611111111111 | 0 |
| 0.8680555555555555 | 0 |
| 0.86875 | 0 |
| 0.8694444444444445 | 0 |
| 0.8701388888888889 | 0 |
| 0.8708333333333332 | 0 |
| 0.8715277777777778 | 0 |
| 0.8722222222222222 | 0 |
| 0.8729166666666667 | 0 |
| 0.873611111111111 | 0 |
| 0.8743055555555556 | 0 |
| 0.875 | 0 |
| 0.8756944444444444 | 0 |
| 0.876388888888889 | 0 |
| 0.8770833333333333 | 0 |
| 0.8777777777777778 | 0 |
| 0.8784722222222222 | 0 |
| 0.8791666666666668 | 0 |
| 0.8798611111111111 | 0 |
| 0.8805555555555555 | 0 |
| 0.88125 | 0 |
| 0.8819444444444445 | 0 |
| 0.8826388888888889 | 0 |
| 0.8833333333333333 | 0 |
| 0.8840277777777777 | 0 |
| 0.8847222222222223 | 0 |
| 0.8854166666666666 | 0 |
| 0.8861111111111111 | 0 |
| 0.8868055555555556 | 0 |
| 0.8875000000000001 | 0 |
| 0.8881944444444444 | 0 |
| 0.8888888888888888 | 0 |
| 0.8895833333333334 | 0 |
| 0.8902777777777778 | 0 |
| 0.8909722222222222 | 0 |
| 0.8916666666666666 | 0 |
| 0.8923611111111112 | 0 |
| 0.8930555555555556 | 0 |
| 0.8937499999999999 | 0 |
| 0.8944444444444444 | 0 |
| 0.8951388888888889 | 0 |
| 0.8958333333333334 | 0 |
| 0.8965277777777777 | 0 |
| 0.8972222222222223 | 0 |
| 0.8979166666666667 | 0 |
| 0.8986111111111111 | 0 |
| 0.8993055555555555 | 0 |
| 0.9 | 0 |
| 0.9006944444444445 | 0 |
| 0.9013888888888889 | 0 |
| 0.9020833333333332 | 0 |
| 0.9027777777777778 | 0 |
| 0.9034722222222222 | 0 |
| 0.9041666666666667 | 0 |
| 0.904861111111111 | 0 |
| 0.9055555555555556 | 0 |
| 0.90625 | 0 |
| 0.9069444444444444 | 0 |
| 0.907638888888889 | 0 |
| 0.9083333333333333 | 0 |
| 0.9090277777777778 | 0 |
| 0.9097222222222222 | 0 |
| 0.9104166666666668 | 0 |
| 0.9111111111111111 | 0 |
| 0.9118055555555555 | 0 |
| 0.9125 | 0 |
| 0.9131944444444445 | 0 |
| 0.9138888888888889 | 0 |
| 0.9145833333333333 | 0 |
| 0.9152777777777777 | 0 |
| 0.9159722222222223 | 0 |
| 0.9166666666666666 | 0 |
| 0.9173611111111111 | 0 |
| 0.9180555555555556 | 0 |
| 0.9187500000000001 | 0 |
| 0.9194444444444444 | 0 |
| 0.9201388888888888 | 0 |
| 0.9208333333333334 | 0 |
| 0.9215277777777778 | 0 |
| 0.9222222222222222 | 0 |
| 0.9229166666666666 | 0 |
| 0.9236111111111112 | 0 |
| 0.9243055555555556 | 0 |
| 0.9249999999999999 | 0 |
| 0.9256944444444444 | 0 |
| 0.9263888888888889 | 0 |
| 0.9270833333333334 | 0 |
| 0.9277777777777777 | 0 |
| 0.9284722222222223 | 0 |
| 0.9291666666666667 | 0 |
| 0.9298611111111111 | 0 |
| 0.9305555555555555 | 0 |
| 0.93125 | 0 |
| 0.9319444444444445 | 0 |
| 0.9326388888888889 | 0 |
| 0.9333333333333332 | 0 |
| 0.9340277777777778 | 0 |
| 0.9347222222222222 | 0 |
| 0.9354166666666667 | 0 |
| 0.936111111111111 | 0 |
| 0.9368055555555556 | 0 |
| 0.9375 | 0 |
| 0.9381944444444444 | 0 |
| 0.938888888888889 | 0 |
| 0.9395833333333333 | 0 |
| 0.9402777777777778 | 0 |
| 0.9409722222222222 | 0 |
| 0.9416666666666668 | 0 |
| 0.9423611111111111 | 0 |
| 0.9430555555555555 | 0 |
| 0.94375 | 0 |
| 0.9444444444444445 | 0 |
| 0.9451388888888889 | 0 |
| 0.9458333333333333 | 0 |
| 0.9465277777777777 | 0 |
| 0.9472222222222223 | 0 |
| 0.9479166666666666 | 0 |
| 0.9486111111111111 | 0 |
| 0.9493055555555556 | 0 |
| 0.9500000000000001 | 0 |
| 0.9506944444444444 | 0 |
| 0.9513888888888888 | 0 |
| 0.9520833333333334 | 0 |
| 0.9527777777777778 | 0 |
| 0.9534722222222222 | 0 |
| 0.9541666666666666 | 0 |
| 0.9548611111111112 | 0 |
| 0.9555555555555556 | 0 |
| 0.9562499999999999 | 0 |
| 0.9569444444444444 | 0 |
| 0.9576388888888889 | 0 |
| 0.9583333333333334 | 0 |
| 0.9590277777777777 | 0 |
| 0.9597222222222223 | 0 |
| 0.9604166666666667 | 0 |
| 0.9611111111111111 | 0 |
| 0.9618055555555555 | 0 |
| 0.9625 | 0 |
| 0.9631944444444445 | 0 |
| 0.9638888888888889 | 0 |
| 0.9645833333333332 | 0 |
| 0.9652777777777778 | 0 |
| 0.9659722222222222 | 0 |
| 0.9666666666666667 | 0 |
| 0.967361111111111 | 0 |
| 0.9680555555555556 | 0 |
| 0.96875 | 0 |
| 0.9694444444444444 | 0 |
| 0.970138888888889 | 0 |
| 0.9708333333333333 | 0 |
| 0.9715277777777778 | 0 |
| 0.9722222222222222 | 0 |
| 0.9729166666666668 | 0 |
| 0.9736111111111111 | 0 |
| 0.9743055555555555 | 0 |
| 0.975 | 0 |
| 0.9756944444444445 | 0 |
| 0.9763888888888889 | 0 |
| 0.9770833333333333 | 0 |
| 0.9777777777777777 | 0 |
| 0.9784722222222223 | 0 |
| 0.9791666666666666 | 0 |
| 0.9798611111111111 | 0 |
| 0.9805555555555556 | 0 |
| 0.9812500000000001 | 0 |
| 0.9819444444444444 | 0 |
| 0.9826388888888888 | 0 |
| 0.9833333333333334 | 0 |
| 0.9840277777777778 | 0 |
| 0.9847222222222222 | 0 |
| 0.9854166666666666 | 0 |
| 0.9861111111111112 | 0 |
| 0.9868055555555556 | 0 |
| 0.9874999999999999 | 0 |
| 0.9881944444444444 | 0 |
| 0.9888888888888889 | 0 |
| 0.9895833333333334 | 0 |
| 0.9902777777777777 | 0 |
| 0.9909722222222223 | 0 |
| 0.9916666666666667 | 0 |
| 0.9923611111111111 | 0 |
| 0.9930555555555555 | 0 |
| 0.99375 | 0 |
| 0.9944444444444445 | 0 |
| 0.9951388888888889 | 0 |
| 0.9958333333333332 | 0 |
| 0.9965277777777778 | 0 |
| 0.9972222222222222 | 0 |
| 0.9979166666666667 | 0 |
| 0.998611111111111 | 0 |
| 0.9993055555555556 | 0 |